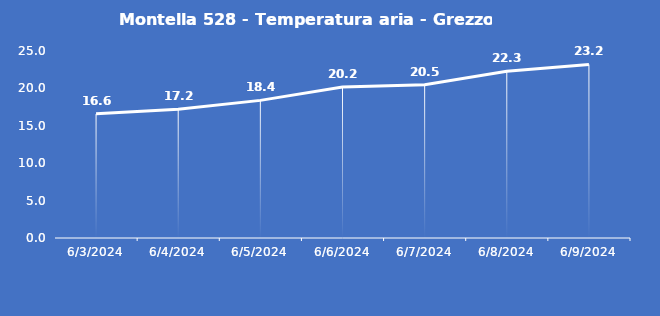
| Category | Montella 528 - Temperatura aria - Grezzo (°C) |
|---|---|
| 6/3/24 | 16.6 |
| 6/4/24 | 17.2 |
| 6/5/24 | 18.4 |
| 6/6/24 | 20.2 |
| 6/7/24 | 20.5 |
| 6/8/24 | 22.3 |
| 6/9/24 | 23.2 |